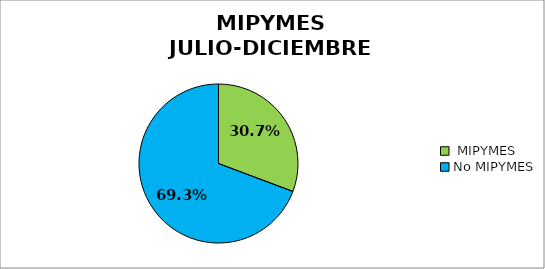
| Category | SISMAP MIPYMES |
|---|---|
|  MIPYMES | 0.307 |
| No MIPYMES | 0.693 |